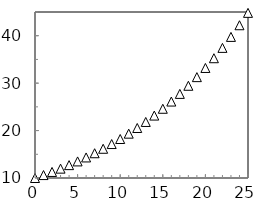
| Category | Series 2 |
|---|---|
| 0.0 | 10 |
| 1.0 | 10.618 |
| 2.0 | 11.275 |
| 3.0 | 11.972 |
| 4.0 | 12.712 |
| 5.0 | 13.499 |
| 6.0 | 14.333 |
| 7.0 | 15.22 |
| 8.0 | 16.161 |
| 9.0 | 17.16 |
| 10.0 | 18.221 |
| 11.0 | 19.348 |
| 12.0 | 20.544 |
| 13.0 | 21.815 |
| 14.0 | 23.164 |
| 15.0 | 24.596 |
| 16.0 | 26.117 |
| 17.0 | 27.732 |
| 18.0 | 29.447 |
| 19.0 | 31.268 |
| 20.0 | 33.201 |
| 21.0 | 35.254 |
| 22.0 | 37.434 |
| 23.0 | 39.749 |
| 24.0 | 42.207 |
| 25.0 | 44.817 |